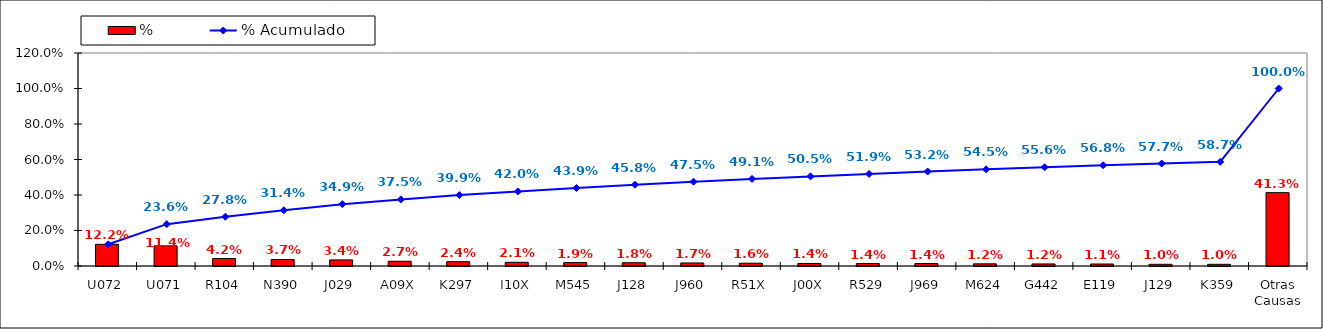
| Category | % |
|---|---|
| U072 | 0.122 |
| U071 | 0.114 |
| R104 | 0.042 |
| N390 | 0.037 |
| J029 | 0.034 |
| A09X | 0.027 |
| K297 | 0.024 |
| I10X | 0.021 |
| M545 | 0.019 |
| J128 | 0.018 |
| J960 | 0.017 |
| R51X | 0.016 |
| J00X | 0.014 |
| R529 | 0.014 |
| J969 | 0.014 |
| M624 | 0.012 |
| G442 | 0.012 |
| E119 | 0.011 |
| J129 | 0.01 |
| K359 | 0.01 |
| Otras Causas | 0.413 |